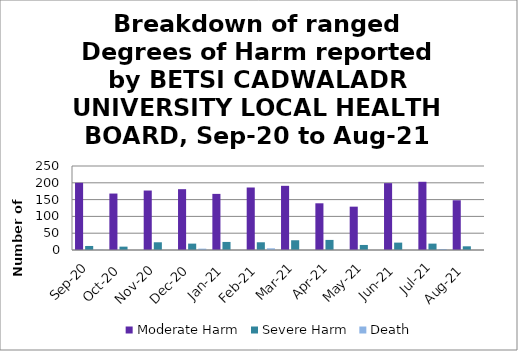
| Category | Moderate Harm | Severe Harm | Death |
|---|---|---|---|
| Sep-20 | 200 | 12 | 1 |
| Oct-20 | 168 | 10 | 0 |
| Nov-20 | 177 | 23 | 0 |
| Dec-20 | 181 | 19 | 4 |
| Jan-21 | 167 | 24 | 0 |
| Feb-21 | 186 | 23 | 5 |
| Mar-21 | 191 | 29 | 0 |
| Apr-21 | 139 | 30 | 0 |
| May-21 | 129 | 15 | 0 |
| Jun-21 | 199 | 22 | 0 |
| Jul-21 | 203 | 19 | 3 |
| Aug-21 | 148 | 11 | 0 |